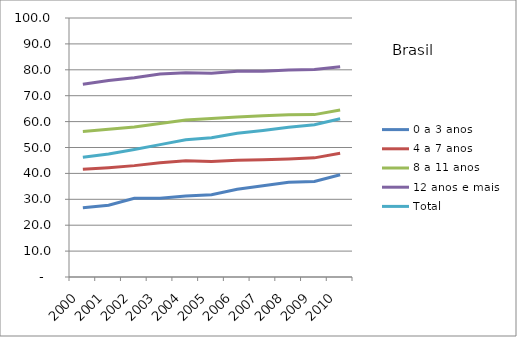
| Category | 0 a 3 anos | 4 a 7 anos | 8 a 11 anos | 12 anos e mais | Total |
|---|---|---|---|---|---|
| 2000.0 | 26.7 | 41.6 | 56.2 | 74.4 | 46.2 |
| 2001.0 | 27.7 | 42.2 | 57 | 75.9 | 47.5 |
| 2002.0 | 30.4 | 43 | 57.9 | 76.9 | 49.2 |
| 2003.0 | 30.4 | 44.1 | 59.3 | 78.4 | 51.1 |
| 2004.0 | 31.3 | 44.9 | 60.6 | 78.9 | 53 |
| 2005.0 | 31.8 | 44.6 | 61.2 | 78.7 | 53.8 |
| 2006.0 | 33.9 | 45.1 | 61.8 | 79.4 | 55.5 |
| 2007.0 | 35.2 | 45.3 | 62.3 | 79.4 | 56.6 |
| 2008.0 | 36.6 | 45.6 | 62.6 | 79.9 | 57.8 |
| 2009.0 | 36.9 | 46 | 62.7 | 80.1 | 58.8 |
| 2010.0 | 39.5 | 47.8 | 64.5 | 81.2 | 61.1 |